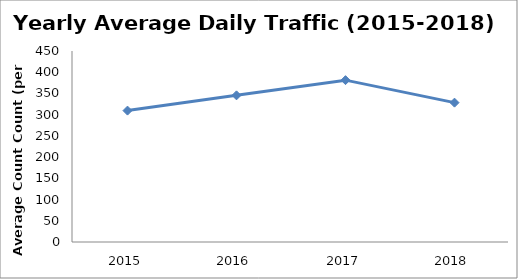
| Category | Series 0 |
|---|---|
| 2015.0 | 309.578 |
| 2016.0 | 345.511 |
| 2017.0 | 381.323 |
| 2018.0 | 328.323 |